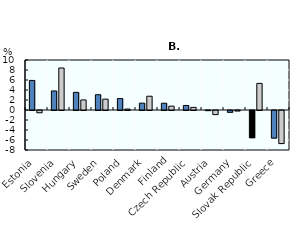
| Category | SME (1-249 persons) | Large (250 persons or more) |
|---|---|---|
| Estonia | 5.916 | -0.445 |
| Slovenia | 3.81 | 8.398 |
| Hungary | 3.529 | 2.014 |
| Sweden | 3.059 | 2.169 |
| Poland | 2.286 | 0.193 |
| Denmark | 1.373 | 2.755 |
| Finland | 1.355 | 0.77 |
| Czech Republic | 0.904 | 0.525 |
| Austria | -0.025 | -0.818 |
| Germany | -0.362 | -0.103 |
| Slovak Republic | -5.44 | 5.318 |
| Greece | -5.517 | -6.617 |